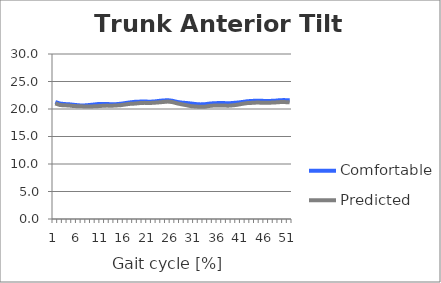
| Category | Comfortable | Predicted |
|---|---|---|
| 0 | 21.276 | 21.008 |
| 1 | 20.988 | 20.716 |
| 2 | 20.896 | 20.677 |
| 3 | 20.851 | 20.627 |
| 4 | 20.758 | 20.527 |
| 5 | 20.665 | 20.513 |
| 6 | 20.632 | 20.469 |
| 7 | 20.704 | 20.44 |
| 8 | 20.789 | 20.474 |
| 9 | 20.888 | 20.511 |
| 10 | 20.908 | 20.573 |
| 11 | 20.917 | 20.616 |
| 12 | 20.854 | 20.594 |
| 13 | 20.881 | 20.643 |
| 14 | 20.959 | 20.701 |
| 15 | 21.085 | 20.829 |
| 16 | 21.207 | 20.944 |
| 17 | 21.307 | 20.985 |
| 18 | 21.342 | 21.075 |
| 19 | 21.371 | 21.117 |
| 20 | 21.325 | 21.083 |
| 21 | 21.356 | 21.134 |
| 22 | 21.463 | 21.198 |
| 23 | 21.548 | 21.271 |
| 24 | 21.596 | 21.353 |
| 25 | 21.492 | 21.253 |
| 26 | 21.283 | 21.024 |
| 27 | 21.161 | 20.846 |
| 28 | 21.086 | 20.682 |
| 29 | 20.998 | 20.516 |
| 30 | 20.893 | 20.445 |
| 31 | 20.836 | 20.4 |
| 32 | 20.878 | 20.431 |
| 33 | 20.993 | 20.566 |
| 34 | 21.059 | 20.645 |
| 35 | 21.079 | 20.632 |
| 36 | 21.076 | 20.617 |
| 37 | 21.034 | 20.61 |
| 38 | 21.106 | 20.674 |
| 39 | 21.177 | 20.798 |
| 40 | 21.288 | 20.957 |
| 41 | 21.411 | 21.075 |
| 42 | 21.471 | 21.118 |
| 43 | 21.507 | 21.171 |
| 44 | 21.482 | 21.15 |
| 45 | 21.467 | 21.117 |
| 46 | 21.477 | 21.156 |
| 47 | 21.52 | 21.197 |
| 48 | 21.613 | 21.256 |
| 49 | 21.614 | 21.256 |
| 50 | 21.57 | 21.206 |